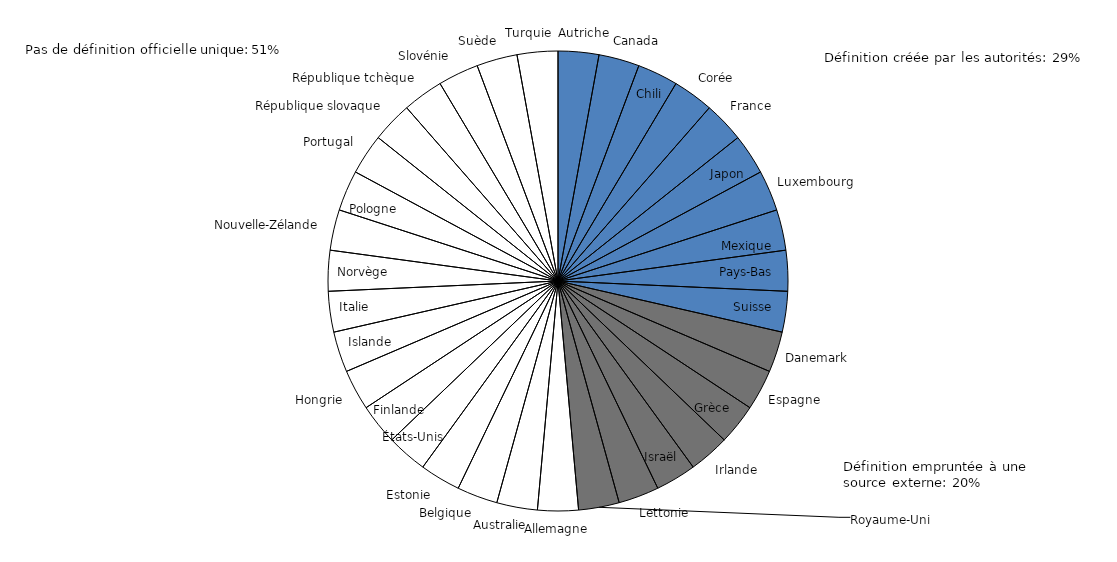
| Category | Series 0 |
|---|---|
| Autriche | 1 |
| Canada | 1 |
| Chili | 1 |
| Corée | 1 |
| France | 1 |
| Japon | 1 |
| Luxembourg | 1 |
| Mexique | 1 |
| Pays-Bas | 1 |
| Suisse | 1 |
| Danemark | 1 |
| Espagne | 1 |
| Grèce | 1 |
| Irlande | 1 |
| Israël | 1 |
| Lettonie | 1 |
| Royaume-Uni | 1 |
| Allemagne | 1 |
| Australie | 1 |
| Belgique | 1 |
| Estonie | 1 |
| États-Unis | 1 |
| Finlande | 1 |
| Hongrie | 1 |
| Islande | 1 |
| Italie | 1 |
| Norvège | 1 |
| Nouvelle-Zélande | 1 |
| Pologne | 1 |
| Portugal | 1 |
| République slovaque | 1 |
| République tchèque | 1 |
| Slovénie | 1 |
| Suède | 1 |
| Turquie | 1 |